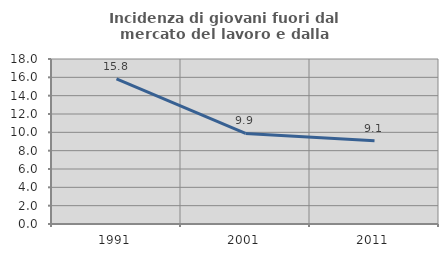
| Category | Incidenza di giovani fuori dal mercato del lavoro e dalla formazione  |
|---|---|
| 1991.0 | 15.823 |
| 2001.0 | 9.877 |
| 2011.0 | 9.091 |